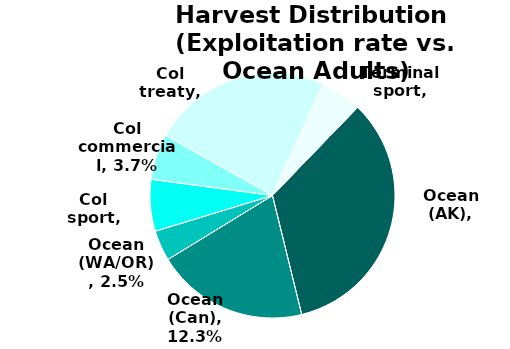
| Category | Series 0 |
|---|---|
| Ocean (AK) | 0.208 |
| Ocean (Can) | 0.123 |
| Ocean (WA/OR) | 0.025 |
| Col sport | 0.042 |
| Col commercial | 0.037 |
| Col treaty | 0.145 |
| Terminal sport | 0.033 |